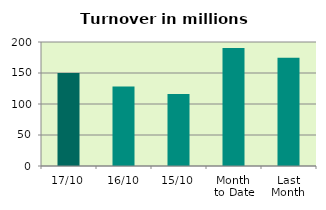
| Category | Series 0 |
|---|---|
| 17/10 | 149.995 |
| 16/10 | 128.186 |
| 15/10 | 115.988 |
| Month 
to Date | 190.335 |
| Last
Month | 174.723 |